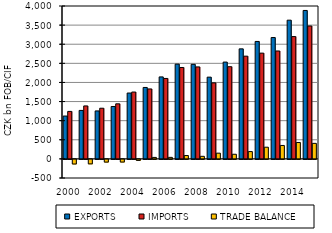
| Category | EXPORTS | IMPORTS | TRADE BALANCE |
|---|---|---|---|
| 2000.0 | 1121.099 | 1241.924 | -120.825 |
| 2001.0 | 1268.149 | 1385.564 | -117.415 |
| 2002.0 | 1254.86 | 1325.671 | -70.811 |
| 2003.0 | 1370.93 | 1440.723 | -69.793 |
| 2004.0 | 1722.657 | 1749.095 | -26.438 |
| 2005.0 | 1868.586 | 1829.962 | 38.624 |
| 2006.0 | 2144.573 | 2104.812 | 39.761 |
| 2007.0 | 2479.234 | 2391.319 | 87.915 |
| 2008.0 | 2473.736 | 2406.489 | 67.246 |
| 2009.0 | 2138.623 | 1989.036 | 149.587 |
| 2010.0 | 2532.797 | 2411.556 | 121.241 |
| 2011.0 | 2878.691 | 2687.563 | 191.128 |
| 2012.0 | 3072.598 | 2766.888 | 305.71 |
| 2013.0 | 3174.704 | 2823.485 | 351.22 |
| 2014.0 | 3628.826 | 3199.63 | 429.195 |
| 2015.0 | 3883.249 | 3477 | 406.249 |